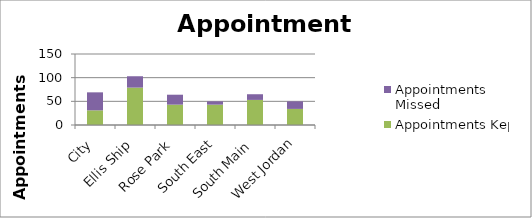
| Category | Appointments Kept | Appointments Missed |
|---|---|---|
| City | 31 | 38 |
| Ellis Ship | 79 | 24 |
| Rose Park | 43 | 21 |
| South East | 43 | 7 |
| South Main | 53 | 12 |
| West Jordan | 34 | 16 |